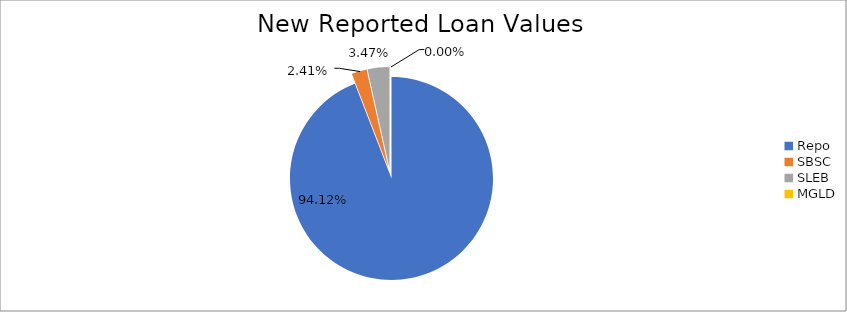
| Category | Series 0 |
|---|---|
| Repo | 10479788.577 |
| SBSC | 268469.824 |
| SLEB | 385983.636 |
| MGLD | 12.048 |